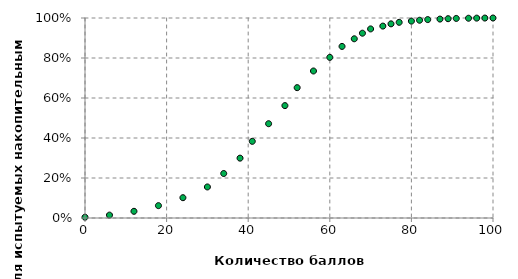
| Category | Series 0 |
|---|---|
| 0.0 | 0.004 |
| 6.0 | 0.014 |
| 12.0 | 0.033 |
| 18.0 | 0.062 |
| 24.0 | 0.101 |
| 30.0 | 0.155 |
| 34.0 | 0.222 |
| 38.0 | 0.299 |
| 41.0 | 0.383 |
| 45.0 | 0.471 |
| 49.0 | 0.562 |
| 52.0 | 0.652 |
| 56.0 | 0.735 |
| 60.0 | 0.803 |
| 63.0 | 0.858 |
| 66.0 | 0.896 |
| 68.0 | 0.924 |
| 70.0 | 0.945 |
| 73.0 | 0.959 |
| 75.0 | 0.971 |
| 77.0 | 0.978 |
| 80.0 | 0.984 |
| 82.0 | 0.989 |
| 84.0 | 0.992 |
| 87.0 | 0.995 |
| 89.0 | 0.996 |
| 91.0 | 0.998 |
| 94.0 | 0.999 |
| 96.0 | 0.999 |
| 98.0 | 1 |
| 100.0 | 1 |